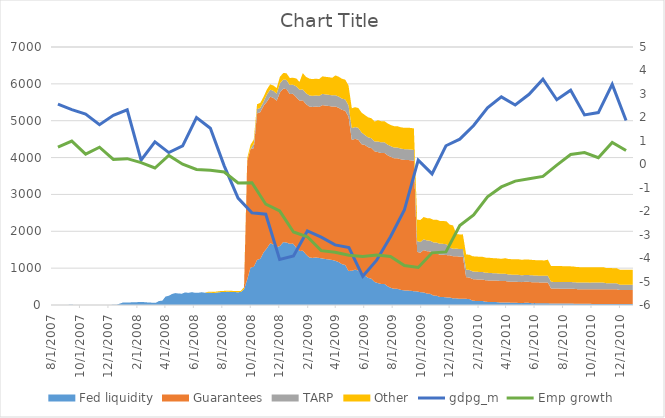
| Category | gdpg_m | Emp growth |
|---|---|---|
| 8/1/07 | 2.568 | 0.731 |
| 9/1/07 | 2.33 | 0.987 |
| 10/1/07 | 2.144 | 0.435 |
| 11/1/07 | 1.688 | 0.729 |
| 12/1/07 | 2.087 | 0.208 |
| 1/1/08 | 2.322 | 0.24 |
| 2/1/08 | 0.172 | 0.068 |
| 3/1/08 | 0.959 | -0.16 |
| 4/1/08 | 0.497 | 0.375 |
| 5/1/08 | 0.78 | 0.003 |
| 6/1/08 | 1.995 | -0.223 |
| 7/1/08 | 1.536 | -0.256 |
| 8/1/08 | -0.066 | -0.329 |
| 9/1/08 | -1.444 | -0.799 |
| 10/1/08 | -2.071 | -0.784 |
| 11/1/08 | -2.129 | -1.702 |
| 12/1/08 | -4.057 | -1.985 |
| 1/1/09 | -3.911 | -2.887 |
| 2/1/09 | -2.841 | -3.09 |
| 3/1/09 | -3.108 | -3.682 |
| 4/1/09 | -3.436 | -3.747 |
| 5/1/09 | -3.547 | -3.879 |
| 6/1/09 | -4.776 | -3.93 |
| 7/1/09 | -4.09 | -3.869 |
| 8/1/09 | -3.091 | -3.933 |
| 9/1/09 | -1.952 | -4.314 |
| 10/1/09 | 0.178 | -4.399 |
| 11/1/09 | -0.408 | -3.776 |
| 12/1/09 | 0.789 | -3.736 |
| 1/1/10 | 1.071 | -2.613 |
| 2/1/10 | 1.653 | -2.16 |
| 3/1/10 | 2.409 | -1.39 |
| 4/1/10 | 2.874 | -0.966 |
| 5/1/10 | 2.53 | -0.718 |
| 6/1/10 | 2.984 | -0.62 |
| 7/1/10 | 3.627 | -0.516 |
| 8/1/10 | 2.75 | -0.039 |
| 9/1/10 | 3.159 | 0.416 |
| 10/1/10 | 2.102 | 0.496 |
| 11/1/10 | 2.204 | 0.278 |
| 12/1/10 | 3.407 | 0.933 |
| 1/1/11 | 1.863 | 0.587 |